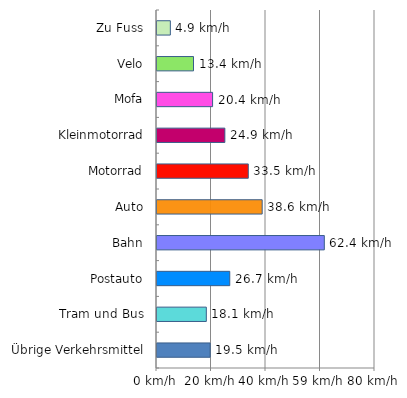
| Category | Series 0 |
|---|---|
| Zu Fuss | 4.9 |
| Velo | 13.4 |
| Mofa | 20.4 |
| Kleinmotorrad | 24.9 |
| Motorrad | 33.5 |
| Auto | 38.6 |
| Bahn | 61.4 |
| Postauto | 26.7 |
| Tram und Bus | 18.1 |
| Übrige Verkehrsmittel | 19.5 |